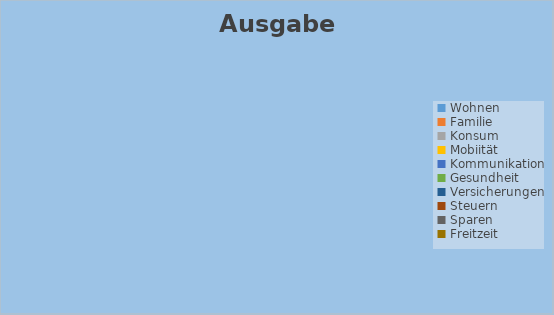
| Category | Series 0 |
|---|---|
| Wohnen | 0 |
| Familie | 0 |
| Konsum | 0 |
| Mobiität | 0 |
| Kommunikation | 0 |
| Gesundheit | 0 |
| Versicherungen | 0 |
| Steuern | 0 |
| Sparen | 0 |
| Freitzeit | 0 |